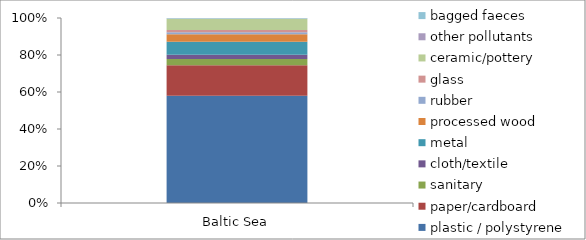
| Category | plastic / polystyrene | paper/cardboard | sanitary | cloth/textile | metal | processed wood | rubber | glass | ceramic/pottery | other pollutants | bagged faeces |
|---|---|---|---|---|---|---|---|---|---|---|---|
| Baltic Sea | 12283 | 3505 | 719 | 479 | 1484 | 850 | 237 | 272 | 1277 | 35 | 49 |